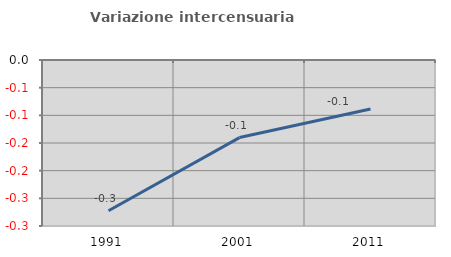
| Category | Variazione intercensuaria annua |
|---|---|
| 1991.0 | -0.273 |
| 2001.0 | -0.14 |
| 2011.0 | -0.088 |